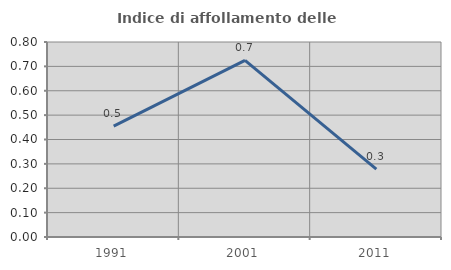
| Category | Indice di affollamento delle abitazioni  |
|---|---|
| 1991.0 | 0.455 |
| 2001.0 | 0.725 |
| 2011.0 | 0.279 |